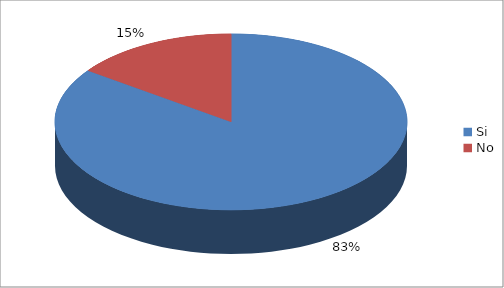
| Category | Series 0 |
|---|---|
| Si | 0.83 |
| No | 0.148 |